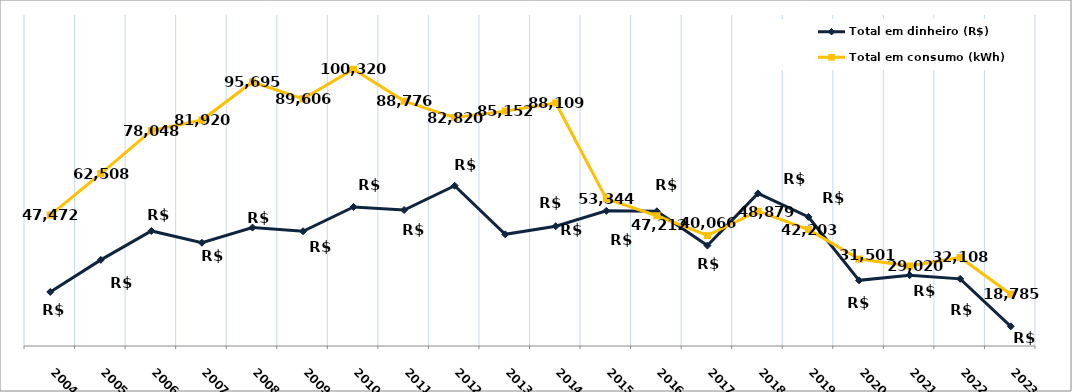
| Category | Total em dinheiro (R$) | Total em consumo (kWh) |
|---|---|---|
| 2004.0 | 19593.51 | 47472 |
| 2005.0 | 31216.71 | 62508 |
| 2006.0 | 41704.82 | 78048 |
| 2007.0 | 37434.66 | 81920 |
| 2008.0 | 42928.85 | 95695 |
| 2009.0 | 41603.96 | 89606 |
| 2010.0 | 50412.45 | 100320 |
| 2011.0 | 49310.52 | 88776 |
| 2012.0 | 58093.55 | 82820 |
| 2013.0 | 40496.51 | 85152 |
| 2014.0 | 43441.11 | 88109 |
| 2015.0 | 49003.02 | 53344 |
| 2016.0 | 48835.1 | 47212 |
| 2017.0 | 36407.12 | 40066 |
| 2018.0 | 55324.73 | 48879 |
| 2019.0 | 46788.46 | 42203 |
| 2020.0 | 23798.02 | 31501 |
| 2021.0 | 25666.47 | 29020 |
| 2022.0 | 24344.73 | 32108 |
| 2023.0 | 7127.44 | 18785 |